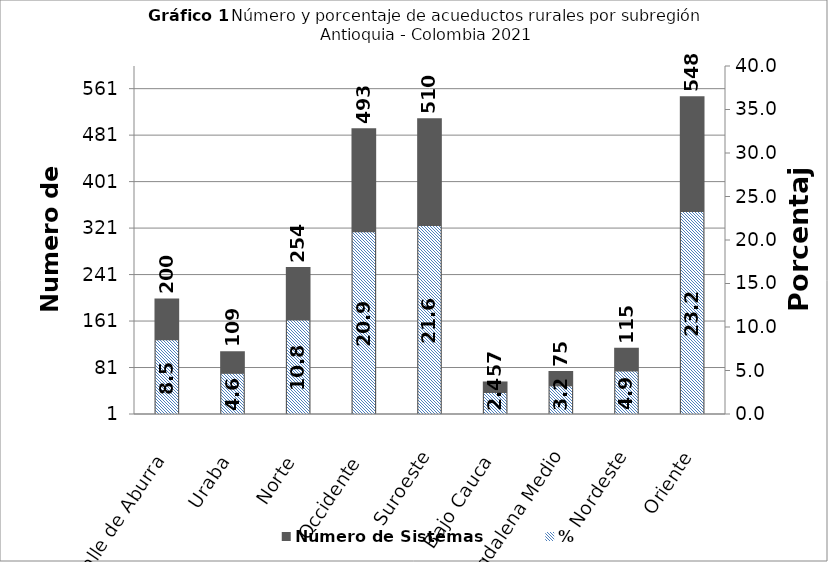
| Category | Número de Sistemas |
|---|---|
| 0 | 200 |
| 1 | 109 |
| 2 | 254 |
| 3 | 493 |
| 4 | 510 |
| 5 | 57 |
| 6 | 75 |
| 7 | 115 |
| 8 | 548 |